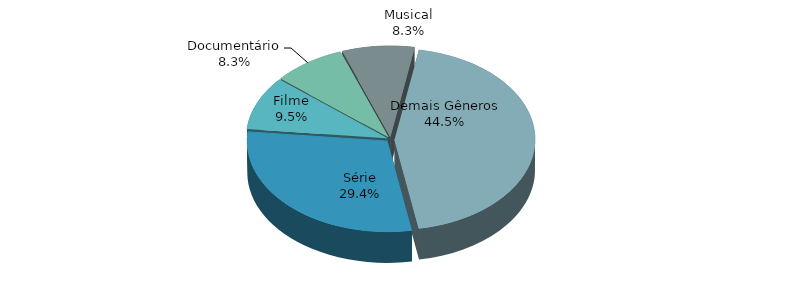
| Category | Series 0 |
|---|---|
| Série | 0.294 |
| Filme | 0.095 |
| Documentário | 0.083 |
| Musical | 0.083 |
| Demais Gêneros | 0.445 |